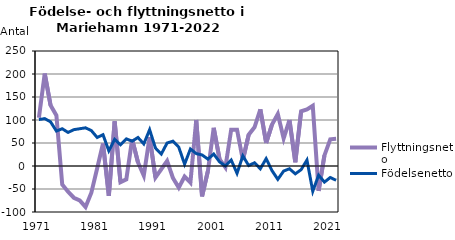
| Category | Flyttningsnetto | Födelsenetto |
|---|---|---|
| 1971 | 105 | 101 |
| 1972 | 201 | 103 |
| 1973 | 132 | 96 |
| 1974 | 110 | 76 |
| 1975 | -40 | 81 |
| 1976 | -56 | 73 |
| 1977 | -69 | 79 |
| 1978 | -75 | 81 |
| 1979 | -89 | 83 |
| 1980 | -58 | 77 |
| 1981 | -5 | 62 |
| 1982 | 49 | 68 |
| 1983 | -65 | 33 |
| 1984 | 97 | 58 |
| 1985 | -35 | 46 |
| 1986 | -29 | 59 |
| 1987 | 58 | 54 |
| 1988 | 8 | 62 |
| 1989 | -21 | 48 |
| 1990 | 63 | 79 |
| 1991 | -25 | 39 |
| 1992 | -7 | 26 |
| 1993 | 11 | 50 |
| 1994 | -26 | 54 |
| 1995 | -47 | 41 |
| 1996 | -23 | 4 |
| 1997 | -36 | 37 |
| 1998 | 100 | 27 |
| 1999 | -66 | 24 |
| 2000 | -11 | 15 |
| 2001 | 83 | 26 |
| 2002 | 15 | 9 |
| 2003 | -3 | 0 |
| 2004 | 79 | 13 |
| 2005 | 79 | -16 |
| 2006 | 13 | 22 |
| 2007 | 68 | 1 |
| 2008 | 84 | 7 |
| 2009 | 123 | -6 |
| 2010 | 50 | 16 |
| 2011 | 90 | -10 |
| 2012 | 113 | -29 |
| 2013 | 60 | -11 |
| 2014 | 100 | -6 |
| 2015 | 8 | -17 |
| 2016 | 119 | -8 |
| 2017 | 123 | 13 |
| 2018 | 131 | -55 |
| 2019 | -54 | -20 |
| 2020 | 23 | -35 |
| 2021 | 58 | -25 |
| 2022 | 59 | -31 |